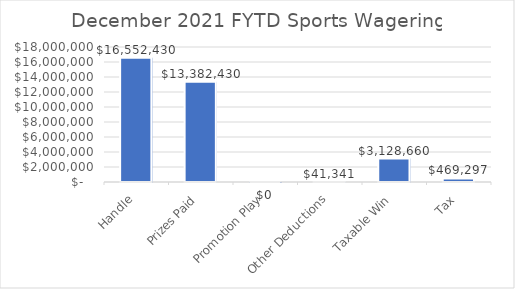
| Category | Series 0 |
|---|---|
| Handle | 16552430.25 |
| Prizes Paid | 13382429.5 |
| Promotion Play | 0 |
| Other Deductions | 41340.53 |
| Taxable Win | 3128660.22 |
| Tax | 469297 |